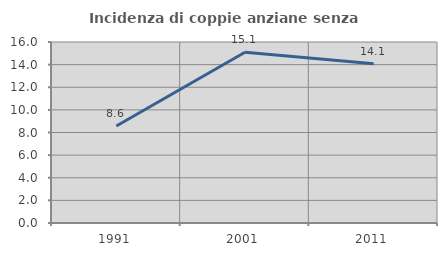
| Category | Incidenza di coppie anziane senza figli  |
|---|---|
| 1991.0 | 8.577 |
| 2001.0 | 15.098 |
| 2011.0 | 14.085 |